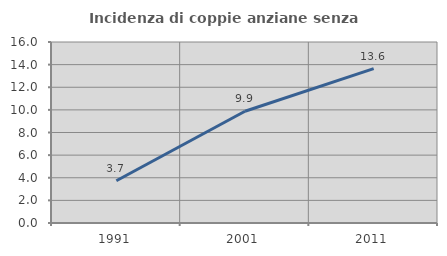
| Category | Incidenza di coppie anziane senza figli  |
|---|---|
| 1991.0 | 3.738 |
| 2001.0 | 9.877 |
| 2011.0 | 13.648 |